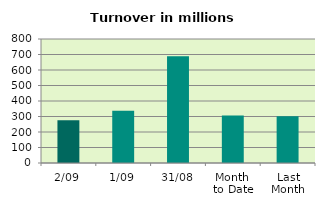
| Category | Series 0 |
|---|---|
| 2/09 | 275.643 |
| 1/09 | 337.488 |
| 31/08 | 689.04 |
| Month 
to Date | 306.566 |
| Last
Month | 301.741 |